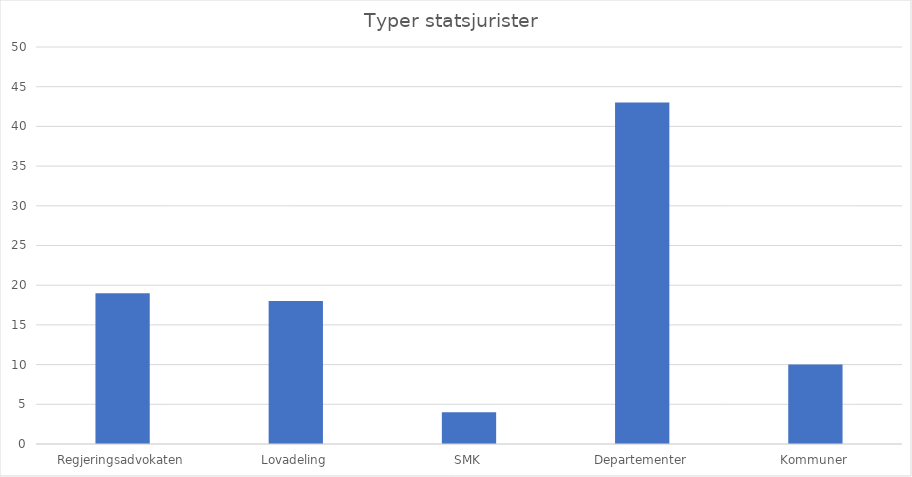
| Category | Series 0 |
|---|---|
| Regjeringsadvokaten | 19 |
| Lovadeling | 18 |
| SMK | 4 |
| Departementer | 43 |
| Kommuner | 10 |